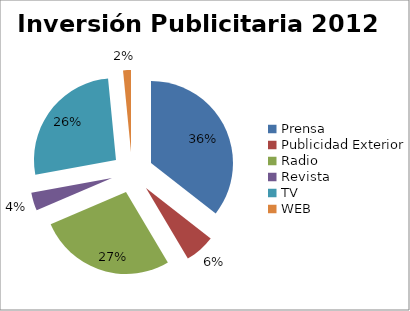
| Category | Series 0 |
|---|---|
| Prensa | 1451937197.84 |
| Publicidad Exterior | 242854206.46 |
| Radio | 1106081014.7 |
| Revista | 146797398.28 |
| TV | 1075503776.8 |
| WEB | 63253085.4 |